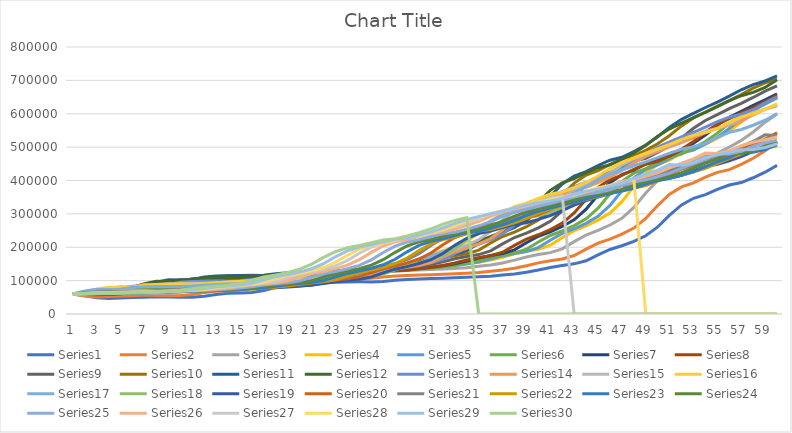
| Category | Series 0 | Series 1 | Series 2 | Series 3 | Series 4 | Series 5 | Series 6 | Series 7 | Series 8 | Series 9 | Series 10 | Series 11 | Series 12 | Series 13 | Series 14 | Series 15 | Series 16 | Series 17 | Series 18 | Series 19 | Series 20 | Series 21 | Series 22 | Series 23 | Series 24 | Series 25 | Series 26 | Series 27 | Series 28 | Series 29 |
|---|---|---|---|---|---|---|---|---|---|---|---|---|---|---|---|---|---|---|---|---|---|---|---|---|---|---|---|---|---|---|
| 0 | 60000 | 60000 | 60000 | 60000 | 60000 | 60000 | 60000 | 60000 | 60000 | 60000 | 60000 | 60000 | 60000 | 60000 | 60000 | 60000 | 60000 | 60000 | 60000 | 60000 | 60000 | 60000 | 60000 | 60000 | 60000 | 60000 | 60000 | 60000 | 60000 | 60000 |
| 1 | 54640.719 | 53819.178 | 56884.545 | 62087.629 | 61531.756 | 60619.308 | 62235.577 | 58783.314 | 59219.397 | 60431.396 | 63069.601 | 66553.48 | 63581.633 | 60982.186 | 61364.282 | 65085.688 | 68633.646 | 64613.662 | 59417.678 | 60651.033 | 64716.066 | 61367.576 | 60489.642 | 60186.799 | 59832.402 | 60915.033 | 62004.905 | 61637.496 | 60606.411 | 60874.786 |
| 2 | 49011.976 | 51024.658 | 58863.775 | 63672.68 | 62166.874 | 62877.96 | 60973.558 | 58018.54 | 59645.18 | 63523.068 | 69958.358 | 70526.316 | 64622.449 | 62368.801 | 66565.609 | 74451.135 | 73911.187 | 63986.562 | 60062.392 | 65418.271 | 66191.136 | 61868.379 | 60677.966 | 60018.68 | 60744.879 | 62950.514 | 63697.118 | 62260.457 | 61490.038 | 61526.587 |
| 3 | 46467.066 | 52800 | 60366.524 | 64329.897 | 64483.188 | 61602.914 | 60180.288 | 58435.689 | 62696.629 | 70461.354 | 74134.444 | 71680.815 | 66091.837 | 67655.272 | 76144.008 | 80176.007 | 73193.851 | 64680.851 | 64783.362 | 66909.345 | 66731.302 | 62060.995 | 60508.475 | 60933.997 | 62774.674 | 64668.534 | 64340.895 | 63168.199 | 62148.426 | 62264.151 |
| 4 | 48083.832 | 54147.945 | 60989.615 | 66726.804 | 63175.592 | 60801.457 | 60612.981 | 61425.261 | 69544.648 | 74667.466 | 75348.007 | 73310.696 | 71693.878 | 77390.467 | 81999.053 | 79397.869 | 73988.044 | 69764.838 | 66259.965 | 67455.373 | 66939.058 | 61887.64 | 61431.262 | 62970.112 | 64487.896 | 65322.129 | 65278.97 | 63844.557 | 62893.445 | 63036.021 |
| 5 | 49311.377 | 54706.849 | 63262.065 | 65373.711 | 62353.674 | 61238.616 | 63713.942 | 68134.415 | 73696.038 | 75889.754 | 77061.273 | 79524.618 | 82010.204 | 83341.358 | 81203.221 | 80259.379 | 79803.587 | 71354.983 | 66800.693 | 67665.383 | 66752.078 | 62831.461 | 63483.992 | 64688.667 | 65139.665 | 66274.51 | 65977.928 | 64609.908 | 63673.116 | 63842.196 |
| 6 | 49820.359 | 56745.205 | 61979.23 | 64523.196 | 62801.993 | 64371.585 | 70673.077 | 72201.622 | 74902.425 | 77615.339 | 83593.099 | 90967.742 | 88316.327 | 82532.499 | 82084.32 | 86567.855 | 81622.545 | 71937.29 | 67008.666 | 67476.374 | 67770.083 | 64930.979 | 65216.572 | 65342.466 | 66089.385 | 66984.127 | 66768.853 | 65410.857 | 64487.439 | 64854.202 |
| 7 | 51676.647 | 55594.521 | 61172.877 | 64987.113 | 66014.944 | 71402.55 | 74891.827 | 73383.546 | 76605.559 | 84194.128 | 95621.654 | 97962.649 | 87459.184 | 83428.021 | 88536.239 | 88540.991 | 82288.642 | 72161.254 | 66821.49 | 68505.425 | 70034.626 | 66703.05 | 65875.706 | 66295.143 | 66797.02 | 67787.115 | 67596.567 | 66247.404 | 65509.674 | 66809.605 |
| 8 | 50628.743 | 54871.233 | 61612.706 | 68311.856 | 73225.405 | 75664.845 | 76117.788 | 75052.144 | 83098.758 | 96309.167 | 102974.42 | 97011.885 | 88408.163 | 89985.556 | 90554.24 | 89263.548 | 82544.833 | 71959.686 | 67840.555 | 70794.54 | 71945.983 | 67377.207 | 66836.158 | 67004.981 | 67597.765 | 68627.451 | 68461.067 | 67297.538 | 67484.84 | 68662.093 |
| 9 | 49970.06 | 55265.753 | 64764.814 | 75773.196 | 77596.513 | 76903.461 | 77848.558 | 81413.673 | 95056.18 | 103714.799 | 101975.015 | 98064.516 | 95357.143 | 92036.591 | 91293.226 | 89541.454 | 82314.261 | 73057.111 | 70107.452 | 72726.636 | 72673.13 | 68359.551 | 67551.789 | 67808.219 | 68435.754 | 69505.135 | 69546.291 | 69326.609 | 69356.05 | 71595.197 |
| 10 | 50329.341 | 58093.151 | 71838.729 | 80296.392 | 78866.75 | 78652.095 | 84447.115 | 93128.621 | 102365.464 | 102708.209 | 103081.499 | 105772.496 | 97530.612 | 92787.675 | 91577.451 | 89291.339 | 83569.599 | 75498.32 | 72020.797 | 73461.673 | 73732.687 | 69091.493 | 68361.582 | 68648.817 | 69310.987 | 70606.909 | 71643.164 | 71248.888 | 72318.799 | 75506.003 |
| 11 | 52904.192 | 64438.356 | 76127.062 | 81610.825 | 80660.025 | 85318.761 | 96598.558 | 100289.687 | 101371.969 | 103822.648 | 111183.819 | 108183.362 | 98326.531 | 93076.553 | 91321.648 | 90653.08 | 86362.084 | 77558.791 | 72748.7 | 74532.727 | 74522.161 | 69919.743 | 69209.04 | 69526.775 | 70409.683 | 72735.761 | 73629.675 | 74292.495 | 76269.131 | 79914.237 |
| 12 | 58682.635 | 68284.932 | 77373.244 | 83466.495 | 87496.887 | 97595.628 | 104026.442 | 99316.338 | 102471.91 | 111983.223 | 113718.025 | 109066.214 | 98632.653 | 92816.562 | 92714.353 | 93682.26 | 88719.044 | 78342.665 | 73809.359 | 75330.767 | 75415.512 | 70786.517 | 70094.162 | 70628.892 | 72532.588 | 74752.568 | 76774.985 | 78350.638 | 80721.917 | 83344.768 |
| 13 | 62185.629 | 69402.74 | 79132.56 | 90541.237 | 100087.173 | 105100.182 | 103016.827 | 100393.975 | 110526.316 | 114535.65 | 114646.044 | 109405.772 | 98357.143 | 94232.065 | 95812.411 | 96239 | 89615.713 | 79484.882 | 74599.653 | 76233.812 | 76350.416 | 71691.814 | 71205.273 | 72758.406 | 74543.762 | 77945.845 | 80968.731 | 82924.948 | 84187.121 | 86072.041 |
| 14 | 63203.593 | 70980.822 | 85839.951 | 103569.588 | 107783.313 | 104080.146 | 104134.615 | 108285.052 | 113045.535 | 115470.342 | 115002.974 | 109100.17 | 99857.143 | 97380.838 | 98427.286 | 97211.672 | 90922.289 | 80335.946 | 75493.934 | 77178.859 | 77326.87 | 72828.25 | 73352.166 | 74775.841 | 77728.119 | 82203.548 | 85695.892 | 86484.723 | 86941.958 | 91389.365 |
| 15 | 64640.719 | 76997.26 | 98191.814 | 111533.505 | 106737.235 | 105209.472 | 112319.711 | 110753.187 | 113968.066 | 115829.838 | 114681.737 | 110764.007 | 103193.878 | 100038.517 | 99422.075 | 98628.995 | 91895.816 | 81298.992 | 76429.809 | 78165.908 | 78552.632 | 75024.077 | 75386.064 | 77970.112 | 81973.929 | 87002.801 | 89374.617 | 89314.743 | 92313.023 | 101492.281 |
| 16 | 70119.76 | 88076.712 | 105742.211 | 110451.031 | 107895.392 | 113479.053 | 114879.808 | 111657.01 | 114322.886 | 115506.291 | 116430.696 | 114465.195 | 106010.204 | 101049.591 | 100871.625 | 99685.039 | 92997.438 | 82306.831 | 77407.279 | 79404.97 | 80921.053 | 77104.334 | 78606.403 | 82229.141 | 86759.777 | 90737.628 | 92299.203 | 94832.394 | 102518.048 | 110771.87 |
| 17 | 80209.581 | 94849.315 | 104715.944 | 111649.485 | 116376.09 | 116065.574 | 115817.308 | 112004.635 | 114003.548 | 117267.825 | 120321.237 | 117589.134 | 107081.633 | 102522.87 | 101951.682 | 100880.037 | 94150.299 | 83359.462 | 78634.315 | 81799.09 | 83164.82 | 80398.074 | 82900.188 | 87029.888 | 90484.171 | 93706.816 | 98001.226 | 105315.93 | 111891.424 | 117135.506 |
| 18 | 86377.246 | 93928.767 | 105852.169 | 120425.258 | 119028.643 | 117012.75 | 116177.885 | 111691.773 | 115742.164 | 121186.339 | 123604.997 | 118777.589 | 108642.857 | 103620.607 | 103173.851 | 102130.616 | 95354.398 | 84680.851 | 81005.199 | 84067.203 | 86717.452 | 84789.727 | 87740.113 | 90765.878 | 93445.065 | 99495.798 | 108835.071 | 114945.12 | 118319.376 | 124751.286 |
| 19 | 85538.922 | 94947.945 | 114172.266 | 123170.103 | 120000 | 117377.049 | 115853.365 | 113395.133 | 119609.698 | 124493.709 | 124854.253 | 120509.338 | 109806.122 | 104862.783 | 104452.866 | 103436.776 | 96865.927 | 87234.043 | 83251.3 | 87658.383 | 91454.294 | 89739.968 | 91506.591 | 93735.99 | 99217.877 | 110494.865 | 118786.021 | 121548.502 | 126012.128 | 134271.012 |
| 20 | 86467.066 | 102410.959 | 116774.588 | 124175.258 | 120373.599 | 117049.18 | 117620.192 | 117184.241 | 122874.039 | 125751.947 | 126674.598 | 121799.66 | 111122.449 | 106162.735 | 105788.726 | 105076.424 | 99786.507 | 89652.856 | 86807.626 | 92446.622 | 96793.629 | 93592.295 | 94500.942 | 99526.775 | 110186.22 | 120597.572 | 125610.055 | 129451.201 | 135628.068 | 149382.504 |
| 21 | 93263.473 | 104745.206 | 117727.55 | 124561.856 | 120037.36 | 118834.244 | 121550.481 | 120382.387 | 124115.908 | 127585.38 | 128030.934 | 123259.762 | 112500 | 107520.462 | 107465.656 | 108244.558 | 102553.373 | 93482.643 | 91549.393 | 97843.892 | 100948.753 | 96654.896 | 100338.983 | 110529.265 | 120260.708 | 127525.677 | 133776.824 | 139329.576 | 150892.29 | 169622.642 |
| 22 | 95389.222 | 105600 | 118094.074 | 124213.918 | 121867.995 | 122805.1 | 124867.788 | 121599.073 | 125925.488 | 128951.468 | 129565.735 | 124787.776 | 113938.776 | 109224.844 | 110705.827 | 111245.947 | 106934.244 | 98589.026 | 96894.281 | 102044.102 | 104252.078 | 102626.003 | 111431.262 | 120635.118 | 127169.46 | 135816.993 | 143985.285 | 155010.383 | 171336.991 | 187152.659 |
| 23 | 96167.665 | 105928.767 | 117764.203 | 126108.247 | 125940.224 | 126156.648 | 126129.808 | 123371.958 | 127273.802 | 130497.304 | 131171.922 | 126383.701 | 115744.898 | 112518.055 | 113775.462 | 115998.147 | 112775.406 | 104344.905 | 101053.726 | 105383.269 | 110692.521 | 113971.108 | 121619.586 | 127565.38 | 135437.616 | 146181.139 | 160190.067 | 176013.052 | 189044.181 | 198627.787 |
| 24 | 96467.066 | 105632.877 | 119560.171 | 130322.165 | 129377.335 | 127431.694 | 127968.75 | 124692.932 | 128799.527 | 132115.039 | 132849.494 | 128387.097 | 119234.694 | 115637.939 | 118635.718 | 122334.414 | 119359.522 | 108824.188 | 104360.485 | 111893.595 | 122929.363 | 124391.653 | 128606.403 | 135859.278 | 145772.812 | 162633.053 | 181894.543 | 194203.5 | 200635.287 | 205008.576 |
| 25 | 96197.605 | 107243.836 | 123555.284 | 133878.866 | 130684.932 | 129289.617 | 129338.942 | 126187.717 | 130396.215 | 133804.674 | 134955.384 | 132258.065 | 122540.816 | 120577.756 | 125116.059 | 129476.61 | 124483.348 | 112385.218 | 110807.626 | 124263.213 | 134168.975 | 131537.721 | 136967.985 | 146226.65 | 162178.771 | 184668.534 | 200692.827 | 206110.946 | 207080.566 | 213825.043 |
| 26 | 97664.671 | 110827.397 | 126927.306 | 135231.959 | 132590.286 | 130673.953 | 130889.423 | 127752.028 | 132063.868 | 135925.704 | 139024.39 | 135925.297 | 127775.51 | 127164.179 | 132420.654 | 135034.738 | 128556.789 | 119328.108 | 123057.192 | 135624.781 | 141876.731 | 140089.888 | 147419.962 | 162683.686 | 184152.7 | 203753.501 | 212998.161 | 212732.127 | 215986.139 | 221406.518 |
| 27 | 100928.144 | 113852.055 | 128210.14 | 137203.608 | 134009.963 | 132240.437 | 132512.019 | 129385.863 | 134157.303 | 140023.966 | 142879.239 | 141731.749 | 134755.102 | 134588.349 | 138105.163 | 139453.451 | 136498.719 | 132519.597 | 134308.492 | 143416.171 | 151101.108 | 150780.096 | 164011.299 | 184726.027 | 203184.358 | 216246.499 | 219840.589 | 221880.747 | 223644.239 | 225608.919 |
| 28 | 103682.635 | 115002.74 | 130079.414 | 138672.68 | 135616.438 | 133879.781 | 134206.731 | 131436.848 | 138202.247 | 143906.531 | 148982.748 | 149473.684 | 142622.449 | 140365.912 | 142624.349 | 148068.55 | 151588.386 | 144636.058 | 142024.263 | 152740.637 | 162631.579 | 167749.599 | 186233.522 | 203816.936 | 215642.458 | 223193.277 | 229294.911 | 229747.849 | 227889.113 | 233876.501 |
| 29 | 104730.539 | 116679.452 | 131472.205 | 140335.052 | 137297.634 | 135591.985 | 136334.135 | 135399.768 | 142034.299 | 150053.925 | 157120.761 | 158200.34 | 148744.898 | 144959.076 | 151435.339 | 164437.239 | 165448.335 | 152945.129 | 151258.232 | 164396.22 | 180934.903 | 190478.331 | 205480.226 | 216313.823 | 222569.832 | 232791.783 | 237424.893 | 234108.573 | 236240.254 | 243413.379 |
| 30 | 106257.485 | 117928.767 | 133048.259 | 142074.742 | 139053.549 | 137741.348 | 140444.711 | 139154.114 | 148101.715 | 158250.449 | 166293.873 | 164991.511 | 153612.245 | 153914.3 | 168176.22 | 179471.978 | 174953.032 | 162889.138 | 162800.693 | 182898.145 | 205450.138 | 210163.724 | 218079.096 | 223262.765 | 232141.527 | 241045.752 | 241931.33 | 242687.63 | 245873.52 | 255162.95 |
| 31 | 107395.21 | 119342.466 | 134697.618 | 143891.753 | 141257.783 | 141894.353 | 144338.942 | 145098.494 | 156191.603 | 167489.515 | 173432.481 | 170390.492 | 163102.041 | 170929.225 | 183552.819 | 189782.307 | 186327.925 | 175319.149 | 181123.05 | 207679.384 | 226682.825 | 223049.759 | 225084.746 | 232864.259 | 240372.44 | 245620.915 | 250797.057 | 252583.803 | 257741.842 | 268936.535 |
| 32 | 108682.635 | 120821.918 | 136420.281 | 146172.68 | 145516.812 | 145828.78 | 150504.808 | 153024.334 | 165310.467 | 174679.449 | 179107.674 | 180916.808 | 181132.653 | 186557.535 | 194097.584 | 202121.352 | 200546.541 | 195050.392 | 205663.778 | 229142.457 | 240581.717 | 230215.088 | 234764.595 | 241120.797 | 244934.823 | 254621.849 | 261023.912 | 264776.031 | 271654.635 | 280325.901 |
| 33 | 110029.94 | 122367.123 | 138582.773 | 150579.897 | 149551.681 | 152058.288 | 158725.961 | 161958.285 | 172406.86 | 180395.446 | 190172.516 | 200916.808 | 197693.878 | 197274.916 | 206717.196 | 217545.16 | 223116.994 | 221478.163 | 226918.544 | 243192.16 | 248310.249 | 240115.57 | 243088.512 | 245697.385 | 253910.615 | 265004.668 | 273623.544 | 279068.526 | 283159.111 | 288816.467 |
| 34 | 111437.126 | 124306.849 | 142761.148 | 154755.155 | 155940.224 | 160364.299 | 167992.788 | 168910.776 | 178048.492 | 191539.844 | 211195.717 | 219286.927 | 209051.02 | 210101.107 | 222491.71 | 242028.717 | 253347.566 | 244367.301 | 240831.889 | 251004.55 | 258988.92 | 248629.214 | 247702.448 | 254701.121 | 264264.432 | 277796.452 | 288393.624 | 290886.977 | 291735.49 | 0 |
| 35 | 113203.593 | 128054.795 | 146719.609 | 161365.979 | 164458.281 | 169726.776 | 175204.327 | 174438.007 | 189047.901 | 212714.2 | 230505.651 | 231884.55 | 222642.857 | 226133.847 | 247531.975 | 274821.677 | 279530.316 | 259350.504 | 248568.458 | 261799.09 | 268171.745 | 253348.315 | 256779.661 | 265087.173 | 277020.484 | 292791.783 | 300606.99 | 299697.419 | 300346.52 | 0 |
| 36 | 116616.766 | 131605.479 | 152987.172 | 170180.412 | 174059.776 | 177012.75 | 180937.5 | 185214.369 | 209946.777 | 232162.972 | 243747.769 | 246960.951 | 239632.653 | 251584.015 | 281070.583 | 303223.715 | 296669.513 | 267681.971 | 259258.232 | 271081.554 | 273261.773 | 262632.424 | 267250.471 | 277882.939 | 291973.929 | 305191.41 | 309711.833 | 308543.459 | 308177.88 | 0 |
| 37 | 119850.299 | 137227.397 | 161343.922 | 180115.979 | 181531.756 | 182805.1 | 192115.385 | 205689.455 | 229142.519 | 245500.3 | 259595.479 | 265806.452 | 266602.041 | 285671.642 | 310118.427 | 321815.655 | 306199.829 | 279193.729 | 268450.607 | 276226.811 | 283275.623 | 273341.894 | 280150.659 | 292882.939 | 304338.92 | 314435.107 | 318853.464 | 316588.549 | 316823.563 | 0 |
| 38 | 124970.06 | 144723.288 | 170763.592 | 187847.938 | 187471.98 | 194098.361 | 213353.365 | 224495.944 | 242306.328 | 261461.953 | 279405.116 | 295721.562 | 302724.49 | 315194.993 | 329133.112 | 332153.775 | 319368.061 | 289092.945 | 273545.927 | 286349.318 | 294826.87 | 286536.116 | 295273.07 | 305286.426 | 313556.797 | 323716.153 | 327167.382 | 325470.187 | 326110.309 | 0 |
| 39 | 131796.407 | 153172.603 | 178094.074 | 193994.845 | 199053.549 | 215555.556 | 232860.577 | 237392.816 | 258060.319 | 281414.02 | 310850.684 | 335789.474 | 334010.204 | 334520.944 | 339706.3 | 346438.166 | 330691.717 | 294580.067 | 283570.191 | 298025.901 | 309058.172 | 302003.21 | 307777.778 | 314533.001 | 322811.918 | 332156.863 | 336345.8 | 335010.383 | 333733.757 | 0 |
| 40 | 139491.018 | 159747.945 | 183921.808 | 205979.381 | 221058.531 | 235264.117 | 246237.981 | 252827.347 | 277752.809 | 313085.68 | 352968.471 | 370492.36 | 354489.796 | 345267.212 | 354315.49 | 358721.63 | 336968.403 | 305375.14 | 295133.449 | 312411.621 | 325740.997 | 314792.938 | 317099.812 | 323816.936 | 331229.05 | 341475.257 | 346204.782 | 342841.887 | 338914.236 | 0 |
| 41 | 145479.042 | 164975.343 | 195284.056 | 228750 | 241270.237 | 248779.599 | 262247.596 | 272120.51 | 309012.419 | 355506.291 | 389446.758 | 393208.829 | 365877.551 | 360115.551 | 366878.257 | 365530.338 | 349316.823 | 317827.548 | 309379.549 | 329275.464 | 339536.011 | 324327.448 | 326459.51 | 332260.274 | 340521.415 | 351484.594 | 354297.977 | 348163.75 | 346329.772 | 0 |
| 42 | 150239.521 | 175167.123 | 216872.327 | 249664.949 | 255130.76 | 264954.463 | 282259.615 | 302746.234 | 350881.135 | 392246.854 | 413325.402 | 405840.407 | 381612.245 | 372883.967 | 373841.781 | 378925.428 | 363561.059 | 333169.093 | 326079.723 | 343220.161 | 349819.945 | 333900.482 | 334971.751 | 341581.569 | 350502.793 | 359701.214 | 0 | 355781.667 | 358024.834 | 0 |
| 43 | 159520.958 | 194531.507 | 236701.283 | 264007.732 | 271718.555 | 285173.042 | 314026.442 | 343765.933 | 387143.702 | 416297.184 | 426603.212 | 423293.718 | 395142.857 | 379961.483 | 387541.449 | 394377.026 | 381110.162 | 351153.415 | 339889.081 | 353615.681 | 360145.429 | 342606.742 | 344369.115 | 351594.022 | 358696.462 | 365284.781 | 0 | 367795.906 | 368143.229 | 0 |
| 44 | 177155.689 | 212317.808 | 250299.328 | 281172.68 | 292453.3 | 317267.76 | 356574.519 | 379293.163 | 410881.135 | 429670.461 | 444949.435 | 438302.207 | 402642.857 | 393885.412 | 403344.386 | 413413.617 | 401682.323 | 366024.636 | 350183.709 | 364053.203 | 369536.011 | 352218.299 | 354463.277 | 359813.201 | 364264.432 | 373277.311 | 0 | 378190.448 | 373982.096 | 0 |
| 45 | 193353.293 | 224515.069 | 266572.999 | 302628.866 | 325367.372 | 360255.009 | 393425.481 | 402549.247 | 424080.426 | 448148.592 | 460725.759 | 446621.392 | 417397.959 | 409947.039 | 422813.832 | 435729.504 | 418693.424 | 377110.862 | 360519.931 | 373545.677 | 379903.047 | 362542.536 | 362749.529 | 365398.505 | 372234.637 | 385882.353 | 0 | 384188.668 | 382471.845 | 0 |
| 46 | 204461.078 | 239112.329 | 286915.088 | 336688.144 | 369452.055 | 397486.339 | 417548.077 | 415480.881 | 442318.155 | 464038.347 | 469470.553 | 462988.115 | 434418.367 | 429735.195 | 445637.139 | 454182.492 | 431374.893 | 388241.881 | 369920.277 | 384025.201 | 391038.781 | 371017.657 | 368380.414 | 373393.524 | 384804.469 | 396788.049 | 0 | 392910.116 | 392711.522 | 0 |
| 47 | 217754.491 | 257358.904 | 319205.864 | 382306.701 | 407633.873 | 421857.923 | 430961.538 | 433348.783 | 458001.183 | 472846.016 | 486674.599 | 481867.572 | 455387.755 | 452932.114 | 464509.711 | 467938.861 | 444107.6 | 398365.062 | 380298.093 | 395281.764 | 400180.055 | 376776.886 | 376440.678 | 386002.491 | 395679.702 | 403081.232 | 0 | 403429.249 | 406035.23 | 0 |
| 48 | 234371.257 | 286323.288 | 362455.712 | 421817.01 | 432627.646 | 435409.836 | 449495.192 | 448713.789 | 466694.263 | 490173.757 | 506519.929 | 505127.335 | 479969.388 | 472113.626 | 478578.873 | 481750.81 | 455687.447 | 409540.873 | 391445.407 | 404522.226 | 406391.967 | 385020.867 | 389152.542 | 396911.582 | 401955.307 | 412231.559 | 0 | 0 | 419133.699 | 0 |
| 49 | 260748.503 | 325117.808 | 399914.478 | 447680.412 | 446525.529 | 454134.79 | 465432.692 | 457230.591 | 483796.57 | 510161.773 | 530969.661 | 532393.888 | 500295.919 | 486413.096 | 492704.879 | 494312.181 | 468471.392 | 421545.353 | 400596.187 | 410801.54 | 415283.933 | 398022.472 | 400150.659 | 403206.725 | 411080.074 | 423267.974 | 0 | 0 | 431090.211 | 0 |
| 50 | 296077.844 | 358717.808 | 424434.942 | 462061.856 | 465728.518 | 470236.794 | 474266.827 | 473986.095 | 503524.541 | 534787.298 | 559631.172 | 554940.577 | 515448.98 | 500770.342 | 505551.871 | 508179.713 | 482203.245 | 431399.776 | 406814.558 | 419789.99 | 429307.479 | 409271.268 | 406497.175 | 412359.9 | 422085.661 | 437628.385 | 0 | 0 | 447640.196 | 0 |
| 51 | 326676.647 | 380712.329 | 438069.639 | 481932.99 | 482241.594 | 479162.113 | 491646.634 | 493314.021 | 527829.687 | 563654.883 | 583331.351 | 571748.727 | 530663.265 | 513827.636 | 519734.723 | 523075.498 | 493475.662 | 438096.305 | 415715.771 | 433965.698 | 441440.443 | 415762.44 | 415725.047 | 423399.751 | 436405.959 | 451746.032 | 0 | 0 | 446048.628 | 0 |
| 52 | 346706.587 | 392942.466 | 456908.98 | 499020.619 | 491394.77 | 496721.311 | 511694.711 | 517126.304 | 556321.703 | 587525.465 | 600999.405 | 588624.788 | 544500 | 528242.658 | 534969.209 | 535303.381 | 501135.781 | 447681.971 | 429753.899 | 446230.312 | 448441.828 | 425200.642 | 426854.991 | 437764.633 | 450484.171 | 464632.867 | 0 | 0 | 453364.02 | 0 |
| 53 | 357844.311 | 409841.096 | 473109.346 | 508492.268 | 509402.242 | 516976.32 | 536394.231 | 545040.556 | 579881.727 | 605320.552 | 618738.846 | 603972.835 | 559775.51 | 543726.529 | 547475.13 | 543612.783 | 512100.768 | 462799.552 | 441899.48 | 453307.665 | 458621.884 | 436584.27 | 441337.1 | 451886.675 | 463335.009 | 482470.588 | 0 | 0 | 467676.004 | 0 |
| 54 | 373233.533 | 424372.603 | 482089.187 | 527126.289 | 530174.346 | 541930.783 | 565348.557 | 568122.828 | 597445.299 | 623187.537 | 634872.1 | 620916.808 | 576183.674 | 556437.169 | 555973.472 | 555507.179 | 529393.681 | 475879.059 | 448908.146 | 463598.18 | 470900.277 | 451396.469 | 455574.388 | 464777.522 | 481122.905 | 480755.182 | 0 | 0 | 477353.797 | 0 |
| 55 | 386467.066 | 432427.397 | 499755.65 | 548621.134 | 555765.878 | 571183.971 | 589290.865 | 585330.244 | 615079.834 | 639436.789 | 652682.927 | 639117.148 | 589653.061 | 565074.627 | 568138.323 | 574265.864 | 544355.252 | 483426.652 | 459098.787 | 476009.8 | 486876.731 | 465958.267 | 468570.433 | 482620.797 | 479412.291 | 488639.776 | 0 | 0 | 484346.232 | 0 |
| 56 | 393802.395 | 448273.973 | 520134.392 | 575103.093 | 585765.878 | 595373.406 | 607139.423 | 602607.184 | 631117.682 | 657375.674 | 671814.396 | 654057.725 | 598806.122 | 577438.613 | 587323.543 | 590495.6 | 552988.898 | 494400.896 | 471389.948 | 492159.608 | 502583.103 | 479250.53 | 486559.322 | 480904.857 | 487274.86 | 504065.36 | 0 | 0 | 492203.408 | 0 |
| 57 | 408233.533 | 466553.425 | 545241.295 | 606146.907 | 610572.852 | 613406.193 | 625060.096 | 618319.815 | 648823.181 | 676644.698 | 687519.334 | 664210.526 | 611908.163 | 596937.891 | 603922.312 | 599861.047 | 565542.271 | 507637.178 | 487383.016 | 508036.402 | 516920.152 | 497649.438 | 484829.379 | 488791.905 | 502657.356 | 514496.172 | 0 | 0 | 492787.294 | 0 |
| 58 | 424880.239 | 489073.973 | 574673.182 | 631817.011 | 629066.003 | 631511.84 | 641358.173 | 635666.28 | 667841.514 | 692462.553 | 698191.553 | 678743.633 | 632571.429 | 613808.378 | 613500.71 | 613478.462 | 580683.177 | 524860.022 | 503105.719 | 522529.017 | 536765.235 | 495880.064 | 492780.791 | 504222.291 | 513059.032 | 522032.68 | 0 | 0 | 499004.216 | 0 |
| 59 | 445389.222 | 515473.973 | 599010.385 | 650953.609 | 647633.873 | 647978.142 | 659350.961 | 654298.957 | 683453.578 | 703211.504 | 713468.174 | 701663.837 | 650448.98 | 623543.573 | 627427.759 | 629902.733 | 600384.287 | 541791.713 | 517457.678 | 542589.43 | 534856.787 | 504012.713 | 508337.1 | 514656.351 | 520574.488 | 530501.214 | 0 | 0 | 509633.555 | 0 |